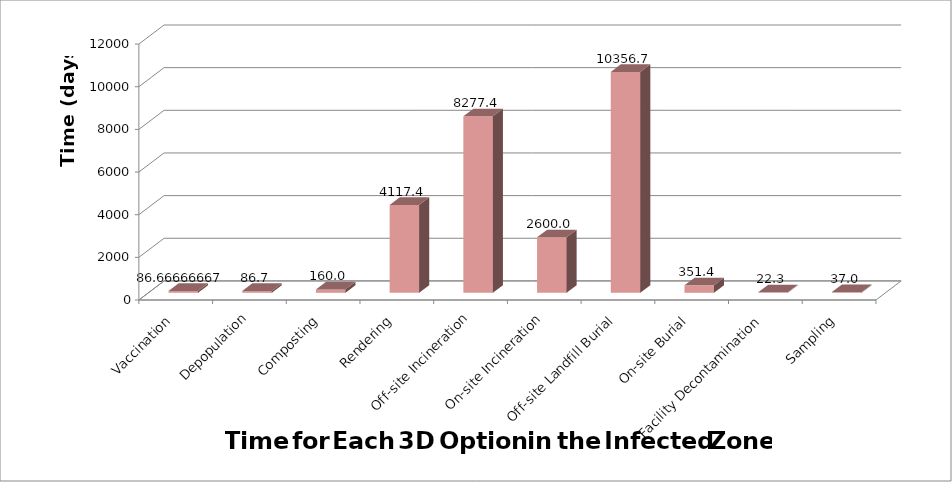
| Category | Series 0 |
|---|---|
| Vaccination | 86.667 |
| Depopulation | 86.667 |
| Composting | 160 |
| Rendering | 4117.352 |
| Off-site Incineration | 8277.352 |
| On-site Incineration | 2600 |
| Off-site Landfill Burial | 10356.667 |
| On-site Burial | 351.351 |
| Facility Decontamination | 22.25 |
| Sampling | 37.014 |